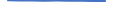
| Category | Series 0 |
|---|---|
| 0 | 367 |
| 1 | 305 |
| 2 | 282 |
| 3 | 271 |
| 4 | 278 |
| 5 | 237 |
| 6 | 240 |
| 7 | 216 |
| 8 | 190 |